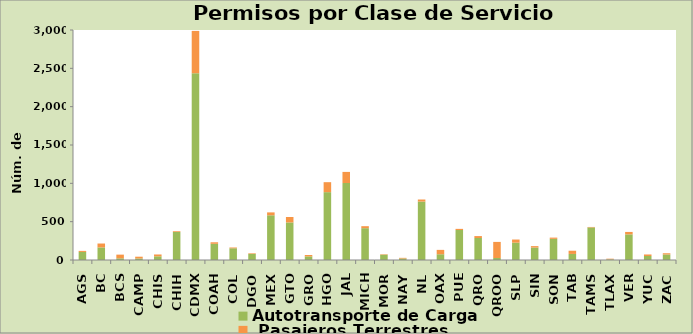
| Category | Autotransporte de Carga  |  Pasajeros Terrestres |
|---|---|---|
| AGS | 105 | 14 |
| BC | 164 | 51 |
| BCS | 22 | 48 |
| CAMP | 20 | 23 |
| CHIS | 48 | 24 |
| CHIH | 365 | 10 |
| CDMX | 2436 | 552 |
| COAH | 211 | 20 |
| COL | 153 | 10 |
| DGO | 79 | 8 |
| MEX | 583 | 38 |
| GTO | 490 | 71 |
| GRO | 47 | 18 |
| HGO | 885 | 130 |
| JAL | 1004 | 145 |
| MICH | 415 | 26 |
| MOR | 69 | 6 |
| NAY | 20 | 8 |
| NL | 762 | 27 |
| OAX | 75 | 57 |
| PUE | 391 | 15 |
| QRO | 287 | 25 |
| QROO | 26 | 210 |
| SLP | 226 | 41 |
| SIN | 162 | 19 |
| SON | 276 | 16 |
| TAB | 79 | 42 |
| TAMS | 425 | 6 |
| TLAX | 8 | 9 |
| VER | 334 | 32 |
| YUC | 52 | 20 |
| ZAC | 72 | 16 |